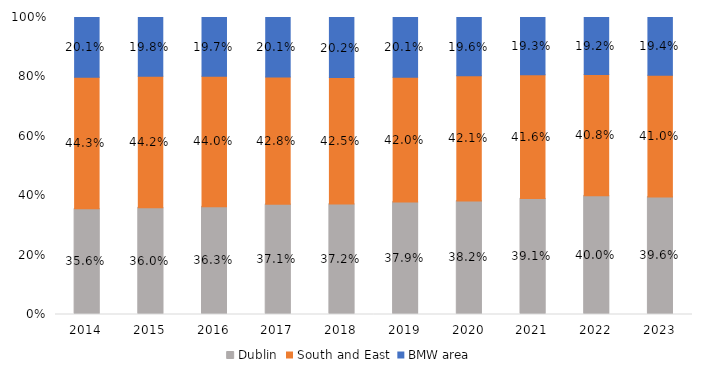
| Category | Dublin | South and East | BMW area |
|---|---|---|---|
| 2014.0 | 0.356 | 0.443 | 0.201 |
| 2015.0 | 0.36 | 0.442 | 0.198 |
| 2016.0 | 0.363 | 0.44 | 0.197 |
| 2017.0 | 0.371 | 0.428 | 0.201 |
| 2018.0 | 0.372 | 0.425 | 0.202 |
| 2019.0 | 0.379 | 0.42 | 0.201 |
| 2020.0 | 0.382 | 0.421 | 0.196 |
| 2021.0 | 0.391 | 0.416 | 0.193 |
| 2022.0 | 0.4 | 0.408 | 0.192 |
| 2023.0 | 0.396 | 0.41 | 0.194 |